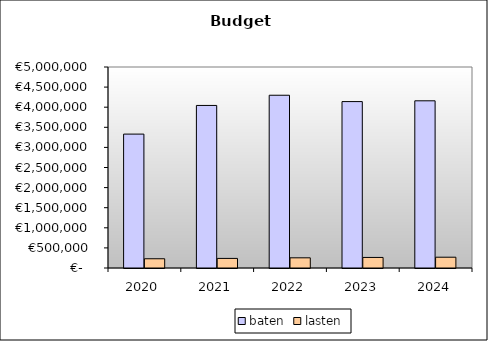
| Category | baten | lasten |
|---|---|---|
| 2020.0 | 3330824.92 | 229952.178 |
| 2021.0 | 4043820.998 | 238648.133 |
| 2022.0 | 4297538.642 | 253172.8 |
| 2023.0 | 4139537.154 | 262716.8 |
| 2024.0 | 4158943.684 | 268473.6 |